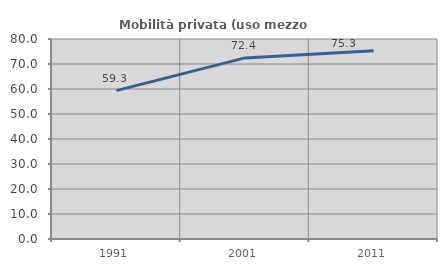
| Category | Mobilità privata (uso mezzo privato) |
|---|---|
| 1991.0 | 59.333 |
| 2001.0 | 72.442 |
| 2011.0 | 75.323 |